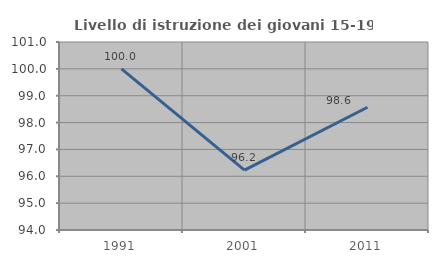
| Category | Livello di istruzione dei giovani 15-19 anni |
|---|---|
| 1991.0 | 100 |
| 2001.0 | 96.226 |
| 2011.0 | 98.571 |